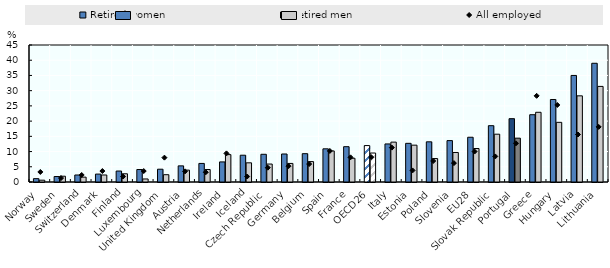
| Category | Retired women | Retired men |
|---|---|---|
| Norway | 1.1 | 0.6 |
| Sweden | 1.8 | 1.9 |
| Switzerland | 2.3 | 1.6 |
| Denmark | 2.6 | 2.3 |
| Finland | 3.6 | 2.7 |
| Luxembourg | 4.1 | 1 |
| United Kingdom | 4.2 | 2.4 |
| Austria | 5.3 | 3.9 |
| Netherlands | 6.1 | 4.1 |
| Ireland | 6.6 | 9 |
| Iceland | 8.8 | 6.3 |
| Czech Republic | 9.1 | 5.9 |
| Germany | 9.2 | 6.1 |
| Belgium | 9.3 | 6.7 |
| Spain | 10.9 | 10.2 |
| France | 11.6 | 7.8 |
| OECD26 | 11.965 | 9.515 |
| Italy | 12.5 | 13.1 |
| Estonia | 12.7 | 12.1 |
| Poland | 13.2 | 7.7 |
| Slovenia | 13.6 | 9.7 |
| EU28 | 14.7 | 11 |
| Slovak Republic | 18.5 | 15.7 |
| Portugal | 20.8 | 14.4 |
| Greece | 22.1 | 22.9 |
| Hungary | 27.1 | 19.6 |
| Latvia | 35 | 28.3 |
| Lithuania | 39 | 31.4 |